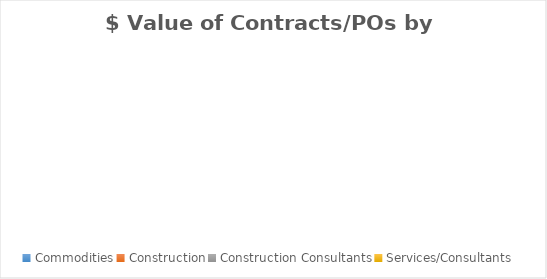
| Category | $ Value |
|---|---|
| Commodities | 0 |
| Construction | 0 |
| Construction Consultants | 0 |
| Services/Consultants | 0 |